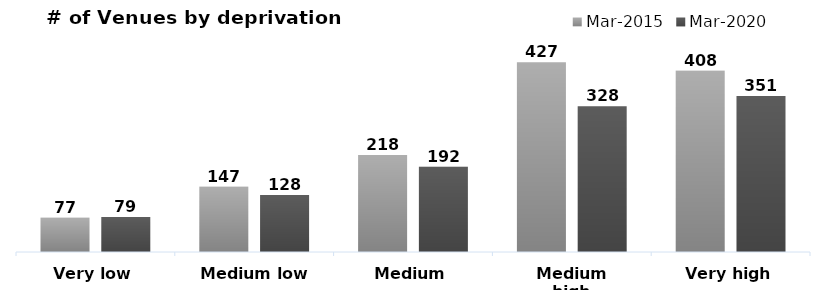
| Category | Mar-2015 | Mar-2020 |
|---|---|---|
| Very low | 77 | 79 |
| Medium low | 147 | 128 |
| Medium | 218 | 192 |
| Medium high | 427 | 328 |
| Very high | 408 | 351 |